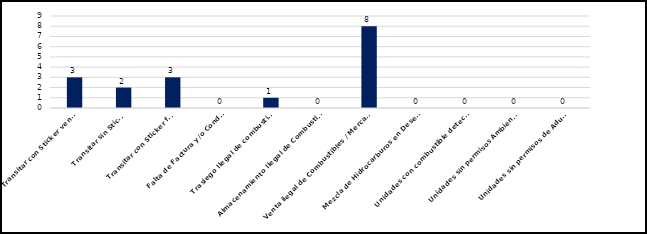
| Category | Series 0 |
|---|---|
| Transitar con Sticker vencido | 3 |
| Transitar sin Sticker | 2 |
| Transitar con Sticker falso | 3 |
| Falta de Factura y/o Conduce | 0 |
| Trasiego Ilegal de combustibles  | 1 |
| Almacenamiento Ilegal de Combustibles  | 0 |
| Venta ilegal de Combustibles / Mercancías | 8 |
| Mezcla de Hidrocarburos en Desechos | 0 |
| Unidades con combustible detectado  | 0 |
| Unidades sin permisos Ambientales | 0 |
| Unidades sin permisos de Aduanas  | 0 |